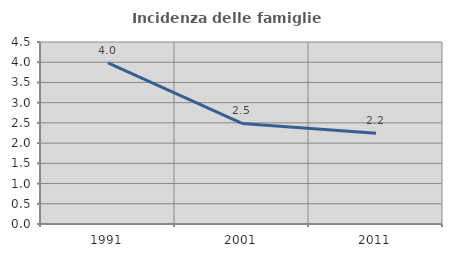
| Category | Incidenza delle famiglie numerose |
|---|---|
| 1991.0 | 3.985 |
| 2001.0 | 2.487 |
| 2011.0 | 2.246 |